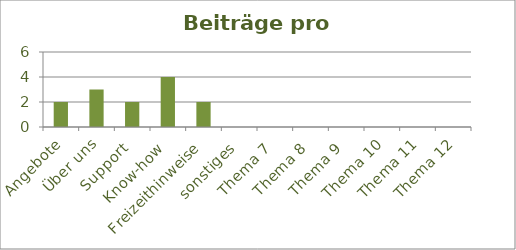
| Category | Beiträge |
|---|---|
| Angebote | 2 |
| Über uns | 3 |
| Support | 2 |
| Know-how | 4 |
| Freizeithinweise | 2 |
| sonstiges | 0 |
| Thema 7 | 0 |
| Thema 8 | 0 |
| Thema 9 | 0 |
| Thema 10 | 0 |
| Thema 11 | 0 |
| Thema 12 | 0 |